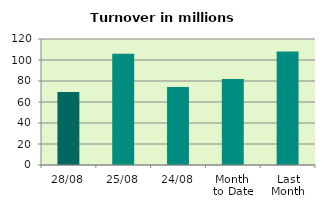
| Category | Series 0 |
|---|---|
| 28/08 | 69.513 |
| 25/08 | 105.903 |
| 24/08 | 74.169 |
| Month 
to Date | 81.911 |
| Last
Month | 108.022 |